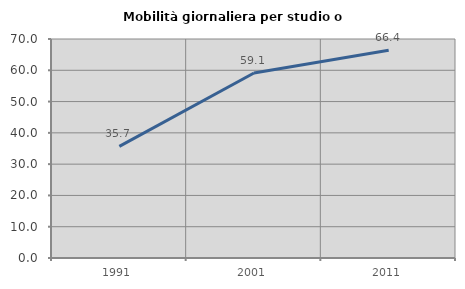
| Category | Mobilità giornaliera per studio o lavoro |
|---|---|
| 1991.0 | 35.695 |
| 2001.0 | 59.14 |
| 2011.0 | 66.405 |